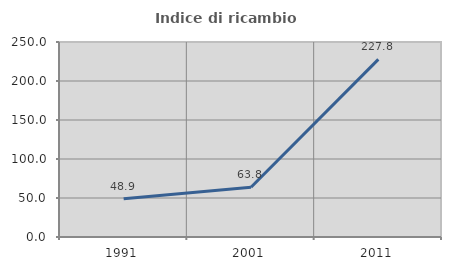
| Category | Indice di ricambio occupazionale  |
|---|---|
| 1991.0 | 48.929 |
| 2001.0 | 63.804 |
| 2011.0 | 227.778 |